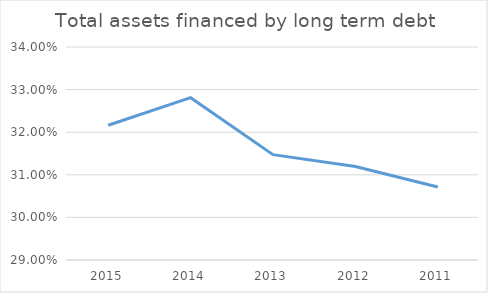
| Category | Series 0 |
|---|---|
| 2015.0 | 0.322 |
| 2014.0 | 0.328 |
| 2013.0 | 0.315 |
| 2012.0 | 0.312 |
| 2011.0 | 0.307 |